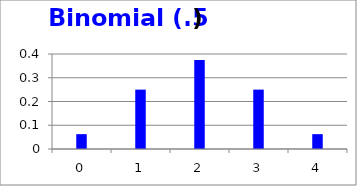
| Category | Series 0 |
|---|---|
| 0.0 | 0.062 |
| 1.0 | 0.25 |
| 2.0 | 0.375 |
| 3.0 | 0.25 |
| 4.0 | 0.062 |